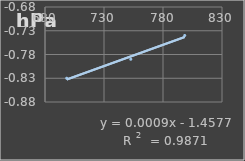
| Category | Presión Atmosférica |
|---|---|
| 698.4 | -0.83 |
| 752.7 | -0.79 |
| 798.4 | -0.74 |